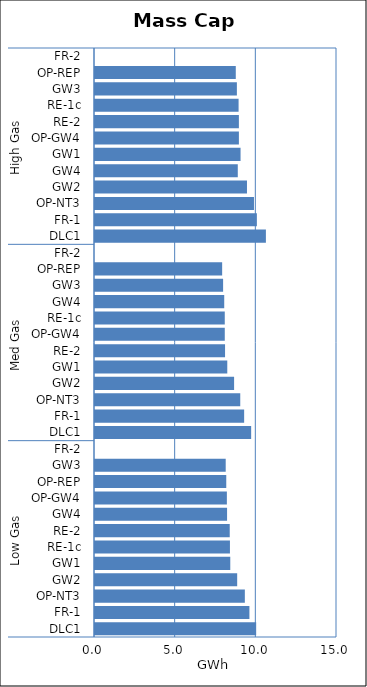
| Category | Mass Cap A |
|---|---|
| 0 | 9.989 |
| 1 | 9.572 |
| 2 | 9.288 |
| 3 | 8.813 |
| 4 | 8.385 |
| 5 | 8.364 |
| 6 | 8.351 |
| 7 | 8.186 |
| 8 | 8.174 |
| 9 | 8.136 |
| 10 | 8.102 |
| 11 | 0 |
| 12 | 9.679 |
| 13 | 9.245 |
| 14 | 9.003 |
| 15 | 8.622 |
| 16 | 8.199 |
| 17 | 8.061 |
| 18 | 8.044 |
| 19 | 8.044 |
| 20 | 8.01 |
| 21 | 7.94 |
| 22 | 7.882 |
| 23 | 0 |
| 24 | 10.593 |
| 25 | 10.034 |
| 26 | 9.854 |
| 27 | 9.42 |
| 28 | 8.85 |
| 29 | 9.022 |
| 30 | 8.919 |
| 31 | 8.919 |
| 32 | 8.9 |
| 33 | 8.794 |
| 34 | 8.726 |
| 35 | 0 |